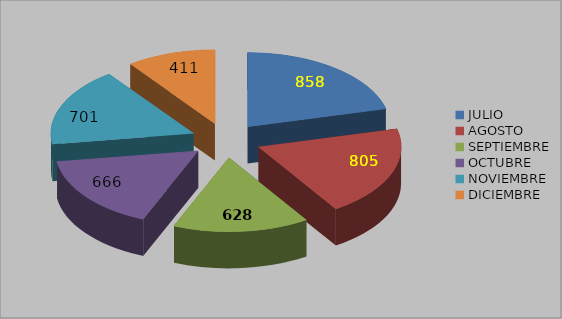
| Category | SOLICITUDES POR NÚMERO DE PREGUNTAS SEGUNDO SEMESTRE 2014 |
|---|---|
| JULIO | 858 |
| AGOSTO | 805 |
| SEPTIEMBRE | 628 |
| OCTUBRE | 666 |
| NOVIEMBRE | 701 |
| DICIEMBRE | 411 |